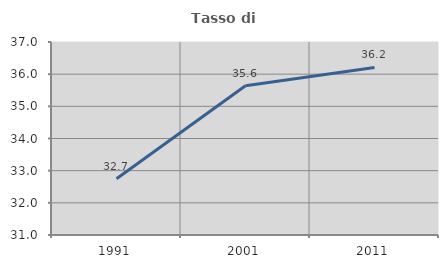
| Category | Tasso di occupazione   |
|---|---|
| 1991.0 | 32.749 |
| 2001.0 | 35.639 |
| 2011.0 | 36.208 |